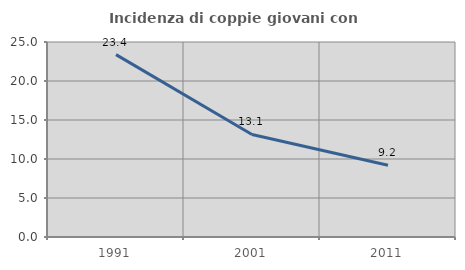
| Category | Incidenza di coppie giovani con figli |
|---|---|
| 1991.0 | 23.383 |
| 2001.0 | 13.15 |
| 2011.0 | 9.203 |